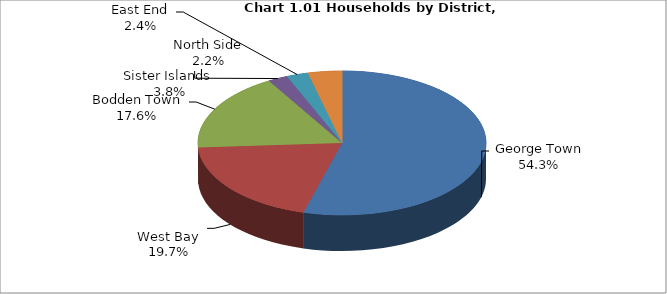
| Category | Series 0 |
|---|---|
| George Town | 12699 |
| West Bay | 4605 |
| Bodden Town | 4107 |
| North Side | 516 |
| East End | 567 |
| Sister Islands  | 894 |